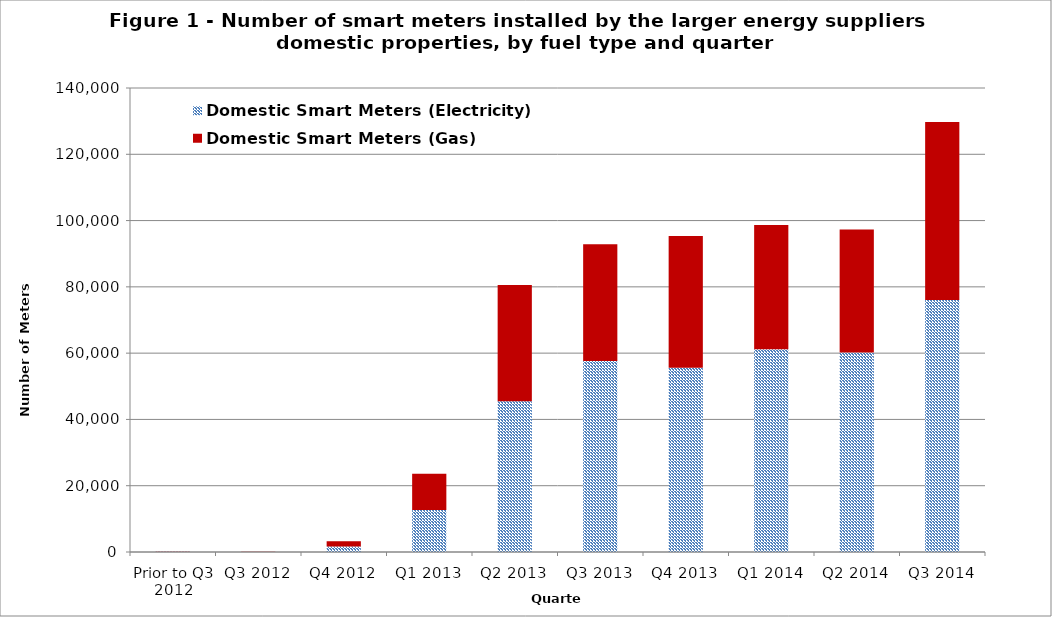
| Category | Domestic Smart Meters (Electricity) | Domestic Smart Meters (Gas) |
|---|---|---|
| Prior to Q3 2012 | 96 | 92 |
| Q3 2012 | 36 | 32 |
| Q4 2012 | 1671 | 1570 |
| Q1 2013 | 12678 | 10963 |
| Q2 2013 | 45456 | 35130 |
| Q3 2013 | 57632 | 35190 |
| Q4 2013 | 55603 | 39730 |
| Q1 2014 | 61164 | 37480 |
| Q2 2014 | 60216 | 37113 |
| Q3 2014 | 76061 | 53682 |